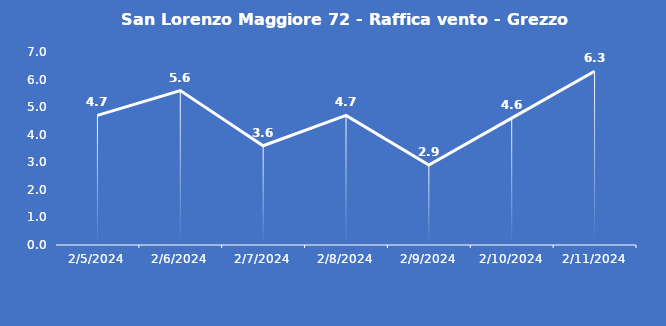
| Category | San Lorenzo Maggiore 72 - Raffica vento - Grezzo (m/s) |
|---|---|
| 2/5/24 | 4.7 |
| 2/6/24 | 5.6 |
| 2/7/24 | 3.6 |
| 2/8/24 | 4.7 |
| 2/9/24 | 2.9 |
| 2/10/24 | 4.6 |
| 2/11/24 | 6.3 |